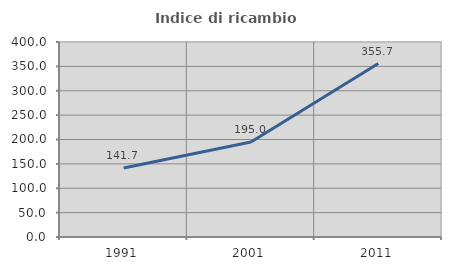
| Category | Indice di ricambio occupazionale  |
|---|---|
| 1991.0 | 141.667 |
| 2001.0 | 195 |
| 2011.0 | 355.714 |